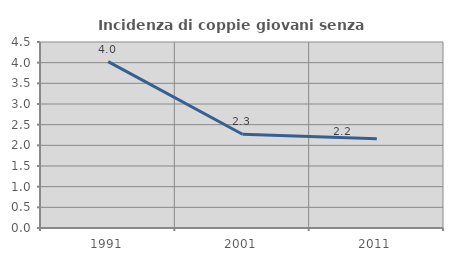
| Category | Incidenza di coppie giovani senza figli |
|---|---|
| 1991.0 | 4.027 |
| 2001.0 | 2.269 |
| 2011.0 | 2.159 |